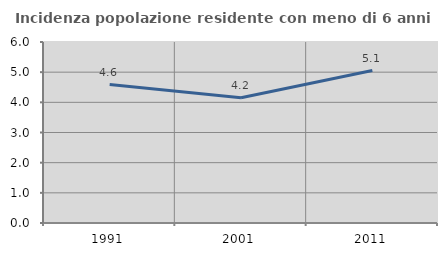
| Category | Incidenza popolazione residente con meno di 6 anni |
|---|---|
| 1991.0 | 4.589 |
| 2001.0 | 4.154 |
| 2011.0 | 5.055 |